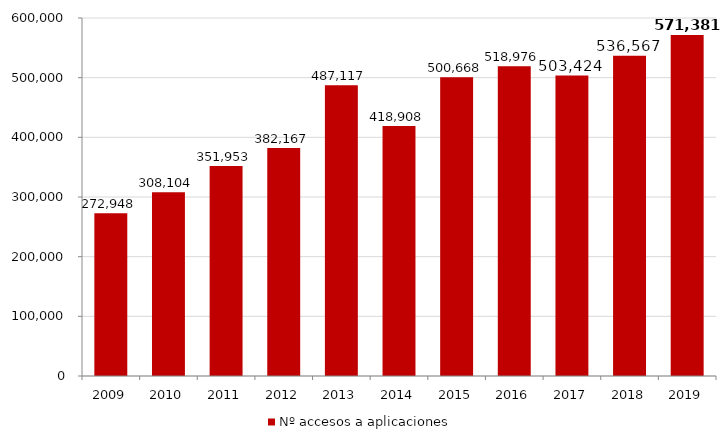
| Category | Nº accesos a aplicaciones |
|---|---|
| 2009.0 | 272948 |
| 2010.0 | 308104 |
| 2011.0 | 351953 |
| 2012.0 | 382167 |
| 2013.0 | 487117 |
| 2014.0 | 418908 |
| 2015.0 | 500668 |
| 2016.0 | 518976 |
| 2017.0 | 503424 |
| 2018.0 | 536567 |
| 2019.0 | 571381 |